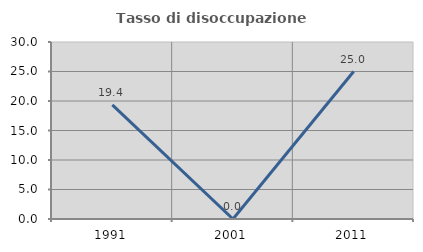
| Category | Tasso di disoccupazione giovanile  |
|---|---|
| 1991.0 | 19.355 |
| 2001.0 | 0 |
| 2011.0 | 25 |